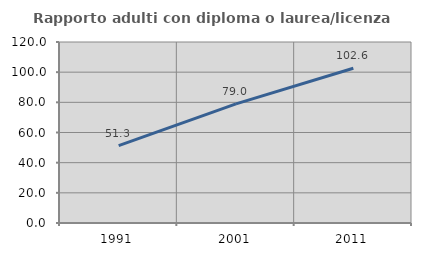
| Category | Rapporto adulti con diploma o laurea/licenza media  |
|---|---|
| 1991.0 | 51.346 |
| 2001.0 | 78.974 |
| 2011.0 | 102.623 |